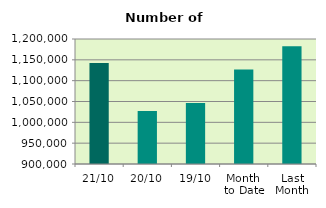
| Category | Series 0 |
|---|---|
| 21/10 | 1142500 |
| 20/10 | 1027266 |
| 19/10 | 1046414 |
| Month 
to Date | 1126919.733 |
| Last
Month | 1182612.273 |